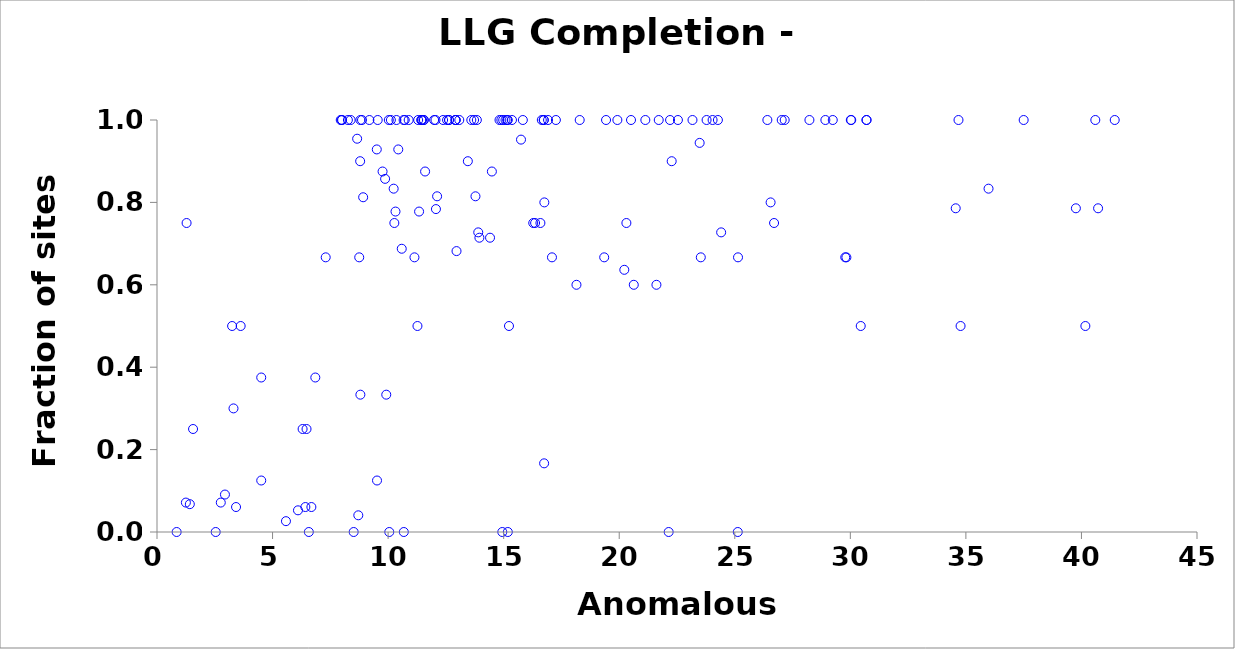
| Category | LLGC-4 |
|---|---|
| 14.94 | 0 |
| 15.18 | 0 |
| 22.14 | 0 |
| 25.13 | 0 |
| 12.05 | 1 |
| 12.64 | 1 |
| 41.44 | 1 |
| 7.3 | 0.667 |
| 19.35 | 0.667 |
| 23.78 | 1 |
| 29.78 | 0.667 |
| 8.8 | 0.333 |
| 9.55 | 1 |
| 9.92 | 0.333 |
| 10.67 | 1 |
| 11.44 | 1 |
| 13.84 | 1 |
| 15.18 | 1 |
| 16.74 | 1 |
| 19.43 | 1 |
| 23.53 | 0.667 |
| 25.14 | 0.667 |
| 29.83 | 0.667 |
| 1.28 | 0.75 |
| 1.56 | 0.25 |
| 2.54 | 0 |
| 3.62 | 0.5 |
| 6.47 | 0.25 |
| 30.45 | 0.5 |
| 34.77 | 0.5 |
| 40.17 | 0.5 |
| 20.31 | 0.75 |
| 26.7 | 0.75 |
| 8.51 | 0 |
| 11.27 | 0.5 |
| 11.55 | 1 |
| 14.98 | 1 |
| 15.08 | 1 |
| 16.59 | 0.75 |
| 16.92 | 1 |
| 18.29 | 1 |
| 19.92 | 1 |
| 20.51 | 1 |
| 21.13 | 1 |
| 22.2 | 1 |
| 22.54 | 1 |
| 27.16 | 1 |
| 28.23 | 1 |
| 30.04 | 1 |
| 8.26 | 1 |
| 16.73 | 1 |
| 20.63 | 0.6 |
| 8.38 | 1 |
| 10.36 | 1 |
| 11.47 | 1 |
| 12.63 | 1 |
| 14.82 | 1 |
| 14.9 | 1 |
| 15.36 | 1 |
| 17.26 | 1 |
| 21.61 | 0.6 |
| 21.71 | 1 |
| 28.92 | 1 |
| 29.24 | 1 |
| 16.75 | 0.167 |
| 23.17 | 1 |
| 24.04 | 1 |
| 24.27 | 1 |
| 26.41 | 1 |
| 27.03 | 1 |
| 30.02 | 1 |
| 30.7 | 1 |
| 30.7 | 1 |
| 34.68 | 1 |
| 37.5 | 1 |
| 10.05 | 0 |
| 8.8 | 1 |
| 9.19 | 1 |
| 10.03 | 1 |
| 10.12 | 1 |
| 12.92 | 1 |
| 0.85 | 0 |
| 6.57 | 0 |
| 4.51 | 0.125 |
| 6.3 | 0.25 |
| 4.51 | 0.375 |
| 6.85 | 0.375 |
| 40.6 | 1 |
| 3.25 | 0.5 |
| 8.87 | 1 |
| 14.49 | 0.875 |
| 7.95 | 1 |
| 7.99 | 1 |
| 8.01 | 1 |
| 9.52 | 0.125 |
| 10.72 | 1 |
| 11.44 | 1 |
| 11.53 | 1 |
| 11.99 | 1 |
| 12.38 | 1 |
| 12.55 | 1 |
| 12.92 | 1 |
| 13.72 | 1 |
| 15.15 | 1 |
| 16.28 | 0.75 |
| 16.65 | 1 |
| 10.32 | 0.778 |
| 11.14 | 0.667 |
| 17.09 | 0.667 |
| 3.31 | 0.3 |
| 8.79 | 0.9 |
| 16.76 | 0.8 |
| 18.15 | 0.6 |
| 13.45 | 0.9 |
| 22.27 | 0.9 |
| 26.55 | 0.8 |
| 15.23 | 0.5 |
| 10.68 | 0 |
| 2.94 | 0.091 |
| 13.9 | 0.727 |
| 20.22 | 0.636 |
| 24.41 | 0.727 |
| 10.24 | 0.833 |
| 10.27 | 0.75 |
| 10.89 | 1 |
| 12.92 | 1 |
| 13.6 | 1 |
| 15.83 | 1 |
| 16.36 | 0.75 |
| 1.25 | 0.071 |
| 2.76 | 0.071 |
| 9.87 | 0.857 |
| 10.44 | 0.929 |
| 9.51 | 0.929 |
| 11.3 | 1 |
| 13.08 | 1 |
| 13.95 | 0.714 |
| 34.56 | 0.786 |
| 39.76 | 0.786 |
| 40.72 | 0.786 |
| 11.6 | 0.875 |
| 8.92 | 0.812 |
| 9.76 | 0.875 |
| 10.59 | 0.688 |
| 23.48 | 0.944 |
| 35.98 | 0.833 |
| 14.41 | 0.714 |
| 15.75 | 0.952 |
| 8.66 | 0.955 |
| 12.96 | 0.682 |
| 13.78 | 0.815 |
| 11.34 | 0.778 |
| 12.12 | 0.815 |
| 6.42 | 0.061 |
| 6.68 | 0.061 |
| 8.75 | 0.667 |
| 6.1 | 0.053 |
| 5.58 | 0.026 |
| 3.42 | 0.061 |
| 8.71 | 0.041 |
| 1.42 | 0.068 |
| 12.07 | 0.784 |